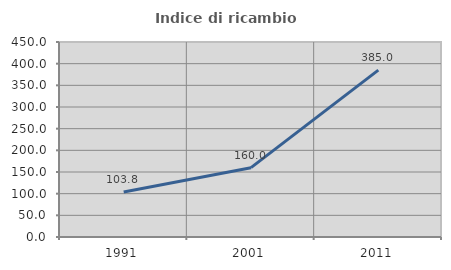
| Category | Indice di ricambio occupazionale  |
|---|---|
| 1991.0 | 103.846 |
| 2001.0 | 160 |
| 2011.0 | 385 |